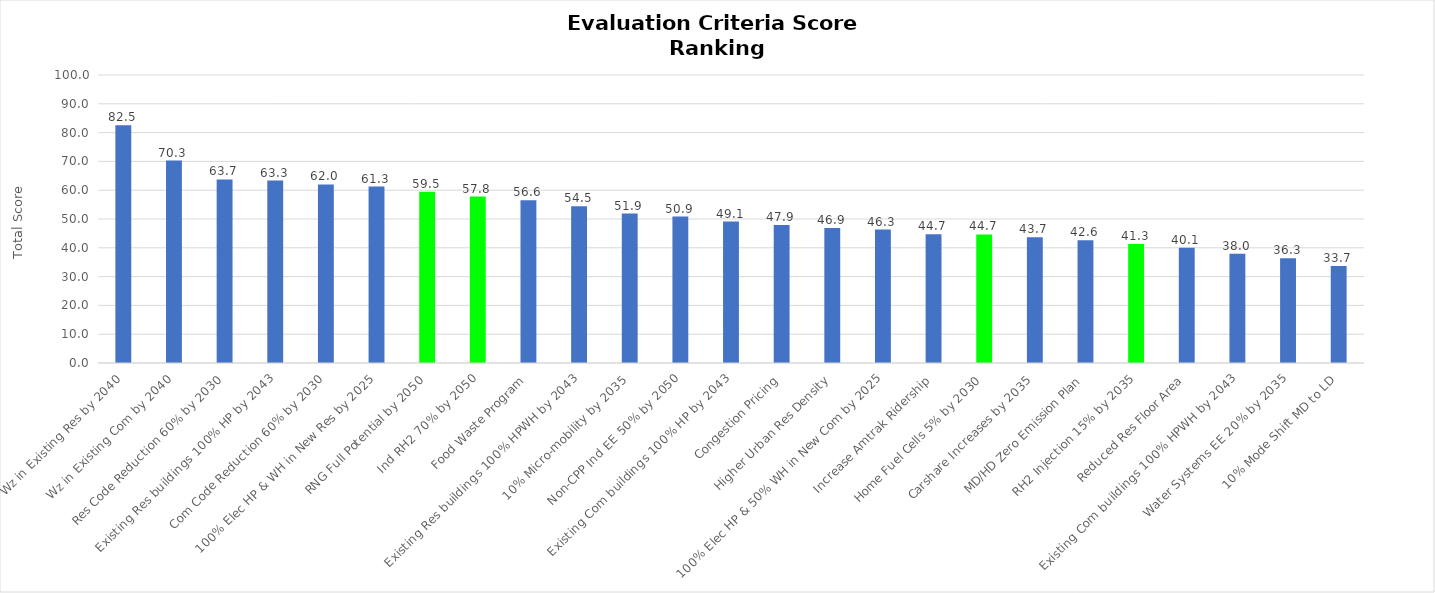
| Category | Series 0 |
|---|---|
| Wz in Existing Res by 2040 | 82.54 |
| Wz in Existing Com by 2040 | 70.3 |
| Res Code Reduction 60% by 2030 | 63.74 |
| Existing Res buildings 100% HP by 2043 | 63.33 |
| Com Code Reduction 60% by 2030 | 62.01 |
| 100% Elec HP & WH in New Res by 2025 | 61.25 |
| RNG Full Potential by 2050 | 59.49 |
| Ind RH2 70% by 2050 | 57.8 |
| Food Waste Program | 56.55 |
| Existing Res buildings 100% HPWH by 2043 | 54.46 |
| 10% Micro-mobility by 2035 | 51.89 |
| Non-CPP Ind EE 50% by 2050 | 50.86 |
| Existing Com buildings 100% HP by 2043 | 49.11 |
| Congestion Pricing | 47.93 |
| Higher Urban Res Density | 46.91 |
| 100% Elec HP & 50% WH in New Com by 2025 | 46.32 |
| Increase Amtrak Ridership | 44.69 |
| Home Fuel Cells 5% by 2030 | 44.66 |
| Carshare Increases by 2035 | 43.67 |
| MD/HD Zero Emission Plan | 42.6 |
| RH2 Injection 15% by 2035 | 41.28 |
| Reduced Res Floor Area | 40.06 |
| Existing Com buildings 100% HPWH by 2043 | 37.95 |
| Water Systems EE 20% by 2035 | 36.34 |
| 10% Mode Shift MD to LD | 33.71 |